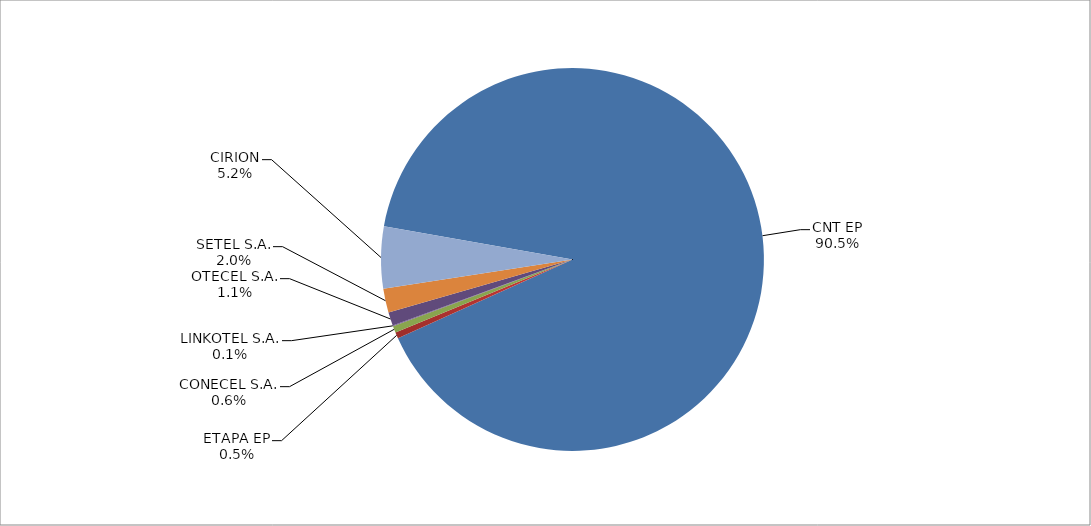
| Category | Series 0 |
|---|---|
| CNT EP | 2927 |
| ETAPA EP | 17 |
| CONECEL S.A. | 18 |
| LINKOTEL S.A. | 2 |
| OTECEL S.A. | 37 |
| SETEL S.A. | 65 |
| CIRION | 169 |